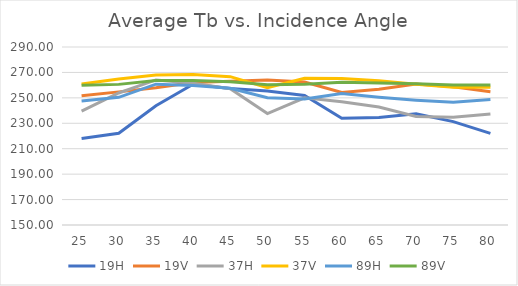
| Category | 19H | 19V | 37H | 37V | 89H | 89V |
|---|---|---|---|---|---|---|
| 25.0 | 218.089 | 251.69 | 239.533 | 260.897 | 247.465 | 259.992 |
| 30.0 | 222.107 | 254.7 | 253.833 | 264.803 | 250.442 | 260.603 |
| 35.0 | 243.764 | 257.896 | 264.082 | 268.048 | 260.755 | 263.704 |
| 40.0 | 260.695 | 262.035 | 261.53 | 268.301 | 259.668 | 263.638 |
| 45.0 | 257.303 | 263.141 | 257.223 | 266.693 | 257.471 | 262.756 |
| 50.0 | 255.432 | 264.091 | 237.668 | 258 | 250.074 | 260.232 |
| 55.0 | 251.891 | 262.522 | 250.027 | 265.368 | 249.032 | 260.739 |
| 60.0 | 233.991 | 254.18 | 246.93 | 265.24 | 253.342 | 262.333 |
| 65.0 | 234.513 | 256.703 | 242.733 | 263.468 | 250.43 | 261.724 |
| 70.0 | 237.397 | 260.976 | 235.394 | 260.616 | 248.168 | 260.999 |
| 75.0 | 231.295 | 258.793 | 234.775 | 258.388 | 246.526 | 260.04 |
| 80.0 | 222.086 | 254.836 | 237.339 | 258.287 | 248.649 | 260.112 |